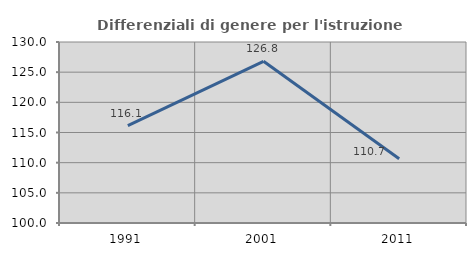
| Category | Differenziali di genere per l'istruzione superiore |
|---|---|
| 1991.0 | 116.148 |
| 2001.0 | 126.802 |
| 2011.0 | 110.65 |